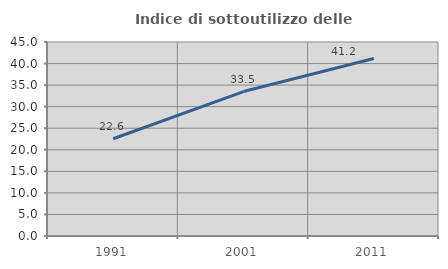
| Category | Indice di sottoutilizzo delle abitazioni  |
|---|---|
| 1991.0 | 22.564 |
| 2001.0 | 33.509 |
| 2011.0 | 41.184 |